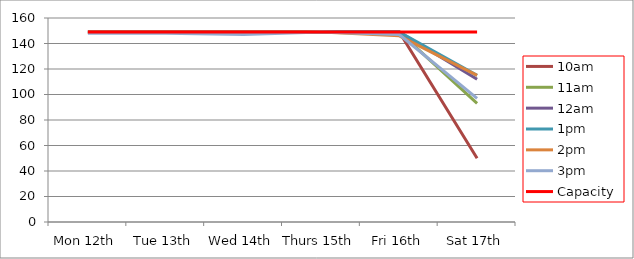
| Category | 9am | 10am | 11am | 12am | 1pm | 2pm | 3pm | 4pm | 5pm | Capacity |
|---|---|---|---|---|---|---|---|---|---|---|
| Mon 12th |  | 149 | 149 | 149 | 149 | 149 | 148 |  |  | 149 |
| Tue 13th |  | 149 | 149 | 149 | 149 | 149 | 148 |  |  | 149 |
| Wed 14th |  | 149 | 149 | 149 | 149 | 149 | 147 |  |  | 149 |
| Thurs 15th |  | 149 | 149 | 149 | 149 | 149 | 149 |  |  | 149 |
| Fri 16th |  | 149 | 149 | 149 | 149 | 146 | 147 |  |  | 149 |
| Sat 17th |  | 50 | 93 | 112 | 115 | 115 | 97 |  |  | 149 |